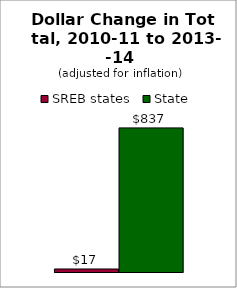
| Category | SREB states | State |
|---|---|---|
| 0 | 17.432 | 836.656 |